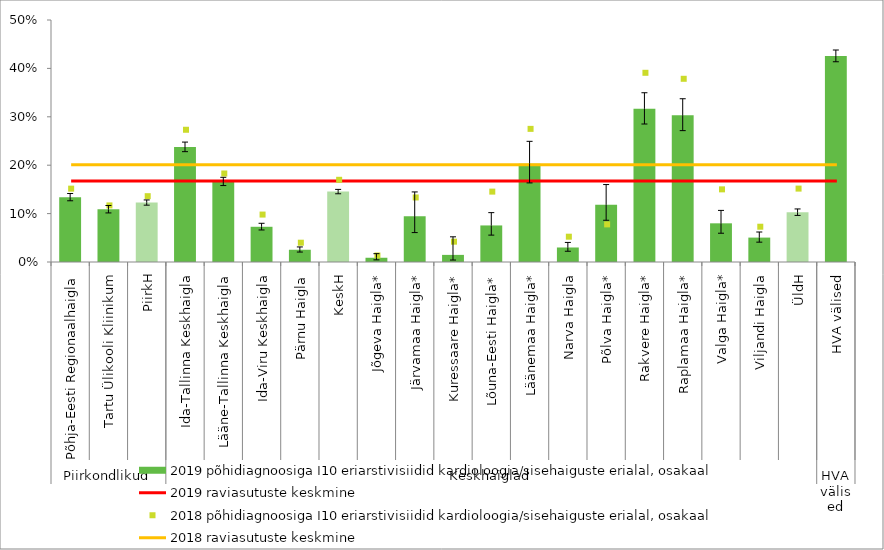
| Category | 2019 põhidiagnoosiga I10 eriarstivisiidid kardioloogia/sisehaiguste erialal, osakaal |
|---|---|
| 0 | 0.134 |
| 1 | 0.109 |
| 2 | 0.123 |
| 3 | 0.238 |
| 4 | 0.166 |
| 5 | 0.073 |
| 6 | 0.025 |
| 7 | 0.145 |
| 8 | 0.009 |
| 9 | 0.095 |
| 10 | 0.015 |
| 11 | 0.076 |
| 12 | 0.203 |
| 13 | 0.03 |
| 14 | 0.118 |
| 15 | 0.317 |
| 16 | 0.303 |
| 17 | 0.08 |
| 18 | 0.05 |
| 19 | 0.103 |
| 20 | 0.426 |